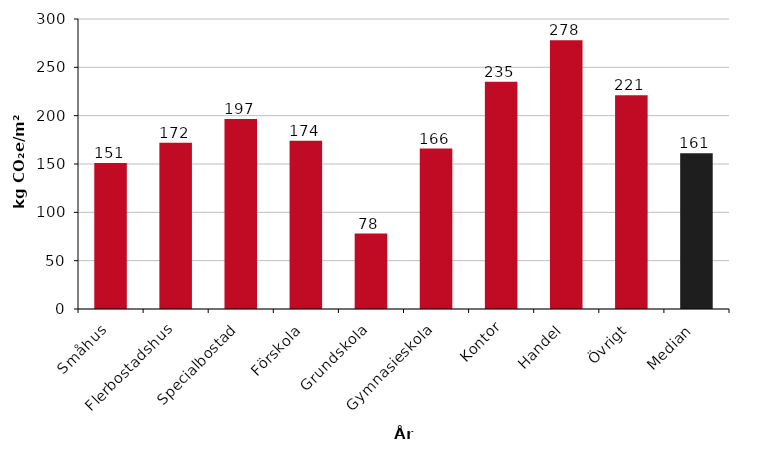
| Category | Median kg CO₂e/m² BTA |
|---|---|
| Småhus | 151 |
| Flerbostadshus | 172 |
| Specialbostad | 196.5 |
| Förskola | 174 |
| Grundskola | 78 |
| Gymnasieskola | 166 |
| Kontor | 235 |
| Handel | 278 |
| Övrigt | 221 |
| Median | 161 |